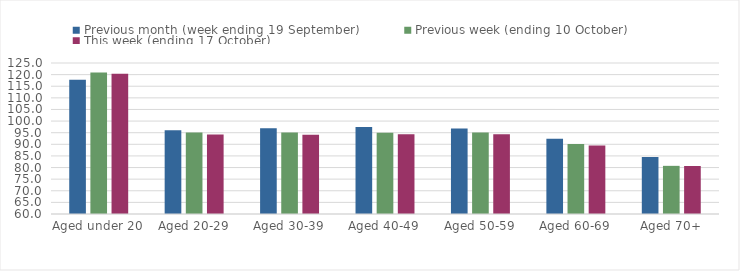
| Category | Previous month (week ending 19 September) | Previous week (ending 10 October) | This week (ending 17 October) |
|---|---|---|---|
| Aged under 20 | 117.79 | 120.96 | 120.32 |
| Aged 20-29 | 96 | 95.12 | 94.17 |
| Aged 30-39 | 96.93 | 95.04 | 94.12 |
| Aged 40-49 | 97.45 | 94.99 | 94.36 |
| Aged 50-59 | 96.85 | 95.07 | 94.37 |
| Aged 60-69 | 92.39 | 90.15 | 89.46 |
| Aged 70+ | 84.5 | 80.73 | 80.67 |